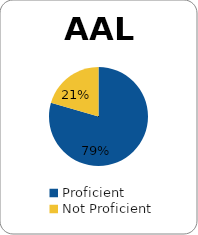
| Category | Series 0 |
|---|---|
| Proficient | 0.795 |
| Not Proficient | 0.205 |